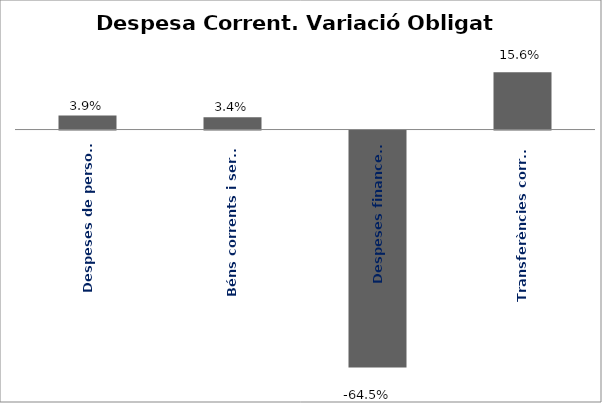
| Category | Series 0 |
|---|---|
| Despeses de personal | 0.039 |
| Béns corrents i serveis | 0.034 |
| Despeses financeres | -0.645 |
| Transferències corrents | 0.156 |